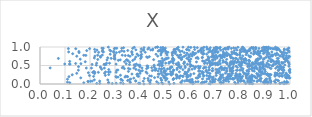
| Category | Series 0 |
|---|---|
| 0.8310107770279482 | 0.358 |
| 0.898913810847134 | 0.953 |
| 0.6540510691226347 | 0.238 |
| 0.3874631804725965 | 0.261 |
| 0.6546207538727327 | 0.905 |
| 0.5547162914851463 | 0.524 |
| 0.7137941692079827 | 0.531 |
| 0.9398200858943669 | 0.945 |
| 0.3341971248897787 | 0.979 |
| 0.849325830463019 | 0.447 |
| 0.9521932139375623 | 0.795 |
| 0.4832545874102593 | 0.983 |
| 0.8845274134972081 | 0.717 |
| 0.9255671018323791 | 0.642 |
| 0.8330063047213393 | 0.155 |
| 0.7443946813726824 | 0.078 |
| 0.580040295929516 | 0.325 |
| 0.4129959694963846 | 0.076 |
| 0.2143592115713148 | 0.206 |
| 0.7431489190879789 | 0.936 |
| 0.27392977666990687 | 0.325 |
| 0.6291189782104226 | 0.981 |
| 0.3923141950374478 | 0.512 |
| 0.5480994509107668 | 0.943 |
| 0.475970111480921 | 0.611 |
| 0.778710897008461 | 0.045 |
| 0.9074800867668688 | 0.068 |
| 0.9037776620426404 | 0.028 |
| 0.7702806819108841 | 0.613 |
| 0.8894891133310451 | 0.544 |
| 0.902071237305825 | 0.97 |
| 0.6762399553611516 | 0.138 |
| 0.7959046290315613 | 0.523 |
| 0.8063001542431134 | 0.597 |
| 0.7995433114804191 | 0.262 |
| 0.5044821907666558 | 0.259 |
| 0.8877825379417206 | 0.901 |
| 0.9592627329327018 | 0.286 |
| 0.9218647605759679 | 0.099 |
| 0.31314582801352503 | 0.639 |
| 0.48806872565542664 | 0.493 |
| 0.5532084250079843 | 0.579 |
| 0.6346657429753184 | 0.426 |
| 0.5873736780547346 | 0.693 |
| 0.6345669806234511 | 0.234 |
| 0.7998804199698862 | 0.195 |
| 0.7414811162366485 | 0.586 |
| 0.6562707594658288 | 0.619 |
| 0.8279009361200589 | 0.838 |
| 0.4900773159576684 | 0.24 |
| 0.49239196022669435 | 0.628 |
| 0.4160103909899449 | 0.983 |
| 0.959775182891374 | 0.015 |
| 0.9649558132031538 | 0.451 |
| 0.45050235401471367 | 0.92 |
| 0.30456789780079735 | 0.317 |
| 0.8415299077367656 | 0.116 |
| 0.8011147144769322 | 0.486 |
| 0.8969722543994947 | 0.019 |
| 0.9728971732582194 | 0.575 |
| 0.7853067797263139 | 0.688 |
| 0.6498396132868661 | 0.722 |
| 0.7602873724734117 | 0.766 |
| 0.8254573203163951 | 0.195 |
| 0.7308539335273225 | 0.789 |
| 0.6920900001822458 | 0.053 |
| 0.46241911056471585 | 0.986 |
| 0.7595983822720573 | 0.562 |
| 0.7672013793731606 | 0.405 |
| 0.8679928045993506 | 0.068 |
| 0.6739168676081639 | 0.68 |
| 0.35333008425872686 | 0.769 |
| 0.4028701660838291 | 0.773 |
| 0.8544608049566019 | 0.805 |
| 0.8316969790569037 | 0.26 |
| 0.8065929921884155 | 0.168 |
| 0.7323330656259425 | 0.634 |
| 0.7089510329999497 | 0.963 |
| 0.525741750297624 | 0.456 |
| 0.8789379566468505 | 0.83 |
| 0.8711829305682173 | 0.235 |
| 0.9464603138654758 | 0.925 |
| 0.8808273798991788 | 0.452 |
| 0.9774131302801313 | 0.063 |
| 0.48878923274467956 | 0.689 |
| 0.7926032203062251 | 0.115 |
| 0.976044360381164 | 0.004 |
| 0.784599218313341 | 0.803 |
| 0.7714492497278236 | 0.435 |
| 0.6716636666285167 | 0.653 |
| 0.6502360847395897 | 0.279 |
| 0.10988232788745472 | 0.13 |
| 0.3770361983834333 | 0.991 |
| 0.42662149881589484 | 0.732 |
| 0.8401600159463561 | 0.728 |
| 0.9835821674586454 | 0.674 |
| 0.818027853412925 | 0.585 |
| 0.6946045362454685 | 0.766 |
| 0.8433917204133137 | 0.162 |
| 0.7103591641817691 | 0.52 |
| 0.7499963302227528 | 0.984 |
| 0.7816802533556325 | 0.167 |
| 0.9473584775730104 | 0.57 |
| 0.6332073159849776 | 0.477 |
| 0.4991087076850885 | 0.362 |
| 0.7414949693387397 | 0.116 |
| 0.8954014955766977 | 0.28 |
| 0.3901637387843155 | 0.213 |
| 0.9901921086657071 | 0.932 |
| 0.4947018814057645 | 0.318 |
| 0.6194026194172059 | 0.451 |
| 0.8623691141625819 | 0.943 |
| 0.5770872422536368 | 0.592 |
| 0.8367386118886505 | 0.903 |
| 0.5085732051234282 | 0.782 |
| 0.8813974761462359 | 0.313 |
| 0.7317172944712216 | 0.586 |
| 0.9995026289255495 | 0.167 |
| 0.7323917930256091 | 0.87 |
| 0.8842106442382358 | 0.242 |
| 0.5490380500892963 | 0.968 |
| 0.14706307284675119 | 0.751 |
| 0.965806114451972 | 0.856 |
| 0.5629650631708083 | 0.045 |
| 0.4840935253730351 | 0.566 |
| 0.8677825730293205 | 0.821 |
| 0.6111828264678153 | 0.859 |
| 0.7560108065812472 | 0.471 |
| 0.6950815745393956 | 0.929 |
| 0.741667561976286 | 0.592 |
| 0.8689529449344396 | 0.815 |
| 0.7105334716028993 | 0.385 |
| 0.9134875279146011 | 0.048 |
| 0.43984963578260705 | 0.049 |
| 0.520646653030767 | 0.445 |
| 0.9084446859639543 | 0.787 |
| 0.5427308140975433 | 0.868 |
| 0.8405144866219514 | 0.064 |
| 0.2778948482536365 | 0.561 |
| 0.7545477409535902 | 0.138 |
| 0.9803553304525544 | 0.605 |
| 0.676051013252801 | 0.45 |
| 0.6247686825269998 | 0.164 |
| 0.8333847532111499 | 0.904 |
| 0.9798389407839876 | 0.846 |
| 0.4725956874228065 | 0.517 |
| 0.35023682881240153 | 0.2 |
| 0.6841654195443744 | 0.19 |
| 0.9606412670425517 | 0.756 |
| 0.8171925395227121 | 0.629 |
| 0.8652312695925554 | 0.66 |
| 0.7477672222256188 | 0.42 |
| 0.9983804236846151 | 0.348 |
| 0.7857297471928586 | 0.37 |
| 0.9272255393161296 | 0.867 |
| 0.879217293120831 | 0.206 |
| 0.9168501956318745 | 0.695 |
| 0.37117588843367755 | 0.637 |
| 0.9362388465612599 | 0.604 |
| 0.9449714545827299 | 0.607 |
| 0.37506067770157875 | 0.158 |
| 0.22062915408735126 | 0.868 |
| 0.2583084597909699 | 0.525 |
| 0.9115873891950943 | 0.956 |
| 0.726774352147922 | 0.384 |
| 0.8817553075434444 | 0.571 |
| 0.4385425575158476 | 0.219 |
| 0.2389344918217612 | 0.015 |
| 0.8039300897386377 | 0.874 |
| 0.9231592055642021 | 0.618 |
| 0.42098778710773344 | 0.859 |
| 0.8997183105528768 | 0.096 |
| 0.9533040395801105 | 0.689 |
| 0.3516914410472728 | 0.631 |
| 0.724952637820579 | 0.044 |
| 0.6258181134650945 | 0.595 |
| 0.8095165996810476 | 0.365 |
| 0.27106096071700114 | 0.11 |
| 0.7158728220097076 | 0.758 |
| 0.789866105139782 | 0.37 |
| 0.3996485300873418 | 0.013 |
| 0.7120369803900983 | 0.299 |
| 0.5533205790661023 | 0.496 |
| 0.9128522499342075 | 0.938 |
| 0.7713443699007935 | 0.15 |
| 0.6845413988958428 | 0.578 |
| 0.2622638686043595 | 0.328 |
| 0.11345961928519897 | 0.957 |
| 0.8528888573004542 | 0.989 |
| 0.48477502539693096 | 0.913 |
| 0.522939904160224 | 0.282 |
| 0.9875496673061606 | 0.832 |
| 0.8206240023487482 | 0.672 |
| 0.7811119521231195 | 0.823 |
| 0.8031293933495766 | 0.381 |
| 0.29994180232330625 | 0.967 |
| 0.5328841448667194 | 0.119 |
| 0.9737978798216494 | 0.443 |
| 0.5309927796124574 | 0.273 |
| 0.6473111218992716 | 0.966 |
| 0.5477458565248681 | 0.196 |
| 0.7315978598934199 | 0.251 |
| 0.7172416947766216 | 0.146 |
| 0.535784255026323 | 0.932 |
| 0.9757967156219038 | 0.685 |
| 0.3807228403256542 | 0.481 |
| 0.6370256151977932 | 0.352 |
| 0.48553321565942525 | 0.293 |
| 0.899670384112283 | 0.079 |
| 0.8952561896358671 | 0.997 |
| 0.8077899506593306 | 0.559 |
| 0.499325156905437 | 0.158 |
| 0.29491346139124913 | 0.853 |
| 0.4310247360817207 | 0.718 |
| 0.985156885218273 | 0.764 |
| 0.5033674877336057 | 0.102 |
| 0.5052461924916255 | 0.247 |
| 0.18524999832942735 | 0.431 |
| 0.8450414376254943 | 0.183 |
| 0.3945082054217518 | 0.208 |
| 0.8439169276649254 | 0.017 |
| 0.7193705397979018 | 0.642 |
| 0.5973887623320678 | 0.746 |
| 0.9239099799512799 | 0.25 |
| 0.5329950253519143 | 0.562 |
| 0.6230409072046375 | 0.83 |
| 0.8069689888433891 | 0.085 |
| 0.5688820297506891 | 0.721 |
| 0.8921633736213997 | 0.911 |
| 0.7827587847772335 | 0.966 |
| 0.6763549033122983 | 0.376 |
| 0.14260642284132147 | 0.554 |
| 0.6086768993685662 | 0.126 |
| 0.8571878037474389 | 0.346 |
| 0.09907804745453262 | 0.54 |
| 0.8407549490183095 | 0.066 |
| 0.950178271335745 | 0.099 |
| 0.7721584476403046 | 0.129 |
| 0.7095821221805166 | 0.572 |
| 0.5651725371380057 | 0.027 |
| 0.4764219467353296 | 0.899 |
| 0.5328176261599242 | 0.684 |
| 0.8882721222144766 | 0.901 |
| 0.724676572609142 | 0.455 |
| 0.30650866921777864 | 0.184 |
| 0.8987105589142876 | 0.85 |
| 0.9097804920680542 | 0.891 |
| 0.2528829802531208 | 0.966 |
| 0.7597314991413845 | 0.785 |
| 0.9886636845234973 | 0.037 |
| 0.873976438663284 | 0.858 |
| 0.11595444398909581 | 0.199 |
| 0.7883020107388226 | 0.251 |
| 0.26602965230152803 | 0.563 |
| 0.8721580116718245 | 0.215 |
| 0.49547877918275396 | 0.424 |
| 0.8361248692064682 | 0.401 |
| 0.5959564175699555 | 0.912 |
| 0.9739760310212294 | 0.388 |
| 0.616940306494386 | 0.797 |
| 0.7469357563131004 | 0.339 |
| 0.2422460849715825 | 0.725 |
| 0.5579404538444357 | 0.772 |
| 0.8390702050578648 | 0.951 |
| 0.6123282612237908 | 0.483 |
| 0.8733390790903882 | 0.796 |
| 0.5066675684986752 | 0.681 |
| 0.8928028797079975 | 0.045 |
| 0.5159165593780775 | 0.558 |
| 0.973412932401149 | 0.453 |
| 0.2962741728043718 | 0.687 |
| 0.5952746428904127 | 0.37 |
| 0.1608799764873733 | 0.671 |
| 0.8168996226560781 | 0.942 |
| 0.29745095348371525 | 0.747 |
| 0.9245184466311898 | 0.603 |
| 0.44572023070721084 | 0.213 |
| 0.48796400169357695 | 0.862 |
| 0.36770618352587797 | 0.269 |
| 0.47273329109977374 | 0.888 |
| 0.9307612166754332 | 0.624 |
| 0.6385553789337394 | 0.264 |
| 0.8361604875694886 | 0.639 |
| 0.5480952965117812 | 0.391 |
| 0.42411137940018234 | 0.325 |
| 0.979353497777742 | 0.668 |
| 0.21901994107908018 | 0.314 |
| 0.990233539932957 | 0.192 |
| 0.5570619922365317 | 0.459 |
| 0.4277107512166789 | 0.487 |
| 0.8559674730150292 | 0.894 |
| 0.9860596251479657 | 0.178 |
| 0.941967630428643 | 0.281 |
| 0.9239644284349605 | 0.417 |
| 0.3598551763916441 | 0.748 |
| 0.8800819617058032 | 0.41 |
| 0.5723234606246189 | 0.212 |
| 0.22686710677309113 | 0.016 |
| 0.6920989914803042 | 0.636 |
| 0.5973925477637794 | 0.073 |
| 0.9647423907510517 | 0.226 |
| 0.8787018227650137 | 0.35 |
| 0.7707294375334107 | 0.152 |
| 0.11875841689782897 | 0.61 |
| 0.7987651789249822 | 0.8 |
| 0.26311228611493914 | 0.524 |
| 0.8357995431627917 | 0.638 |
| 0.9171722605909588 | 0.214 |
| 0.868676827957605 | 0.55 |
| 0.8024046958732404 | 0.138 |
| 0.749937616714364 | 0.19 |
| 0.75861364309273 | 0.504 |
| 0.29946956491571797 | 0.788 |
| 0.6303042974092957 | 0.164 |
| 0.4426821438034973 | 0.1 |
| 0.7820985669663144 | 0.695 |
| 0.7135820946078818 | 0.102 |
| 0.38263105935895414 | 0.085 |
| 0.577666237432893 | 0.589 |
| 0.9928372839313657 | 0.702 |
| 0.6955460769990373 | 0.762 |
| 0.9581088258550733 | 0.405 |
| 0.5183940812617381 | 0.001 |
| 0.6655599960809735 | 0.366 |
| 0.530291145724821 | 0.652 |
| 0.5610258677446649 | 0.702 |
| 0.8505502119942417 | 0.009 |
| 0.3484943293593561 | 0.651 |
| 0.8831921095688857 | 0.538 |
| 0.13063840018600253 | 0.818 |
| 0.8521740466276149 | 0.432 |
| 0.72232360397711 | 0.252 |
| 0.727274911807432 | 0.444 |
| 0.9469645070313905 | 0.558 |
| 0.21825279882837856 | 0.282 |
| 0.859202207237307 | 0.545 |
| 0.9870197331873705 | 0.067 |
| 0.6538518158103037 | 0.819 |
| 0.4337780605240297 | 0.093 |
| 0.6776653697656364 | 0.603 |
| 0.507340403325938 | 0.864 |
| 0.9478457852277057 | 0.974 |
| 0.6091619561932633 | 0.079 |
| 0.3509698254813633 | 0.906 |
| 0.9643359628872321 | 0.414 |
| 0.8478584686017823 | 0.096 |
| 0.33259372507377705 | 0.462 |
| 0.85304804654503 | 0.534 |
| 0.6899711205564897 | 0.118 |
| 0.8443710630418527 | 0.021 |
| 0.43087552476878466 | 0.485 |
| 0.7367890288640014 | 0.382 |
| 0.6460245307777702 | 0.841 |
| 0.9956331902126067 | 0.478 |
| 0.3049819633635724 | 0.018 |
| 0.3706019974507442 | 0.964 |
| 0.6381310569431831 | 0.436 |
| 0.995100712558046 | 0.972 |
| 0.7723665054234549 | 0.359 |
| 0.35871891826285596 | 0.588 |
| 0.6900684817154815 | 0.813 |
| 0.9963353475863782 | 0.868 |
| 0.4561677710182015 | 0.488 |
| 0.9836175759458071 | 0.676 |
| 0.4284427746212669 | 0.291 |
| 0.44689996623253503 | 0.441 |
| 0.23108159156773128 | 0.664 |
| 0.9938478332823799 | 0.579 |
| 0.6099351785126065 | 0.053 |
| 0.8164316022576554 | 0.947 |
| 0.4904965146743663 | 0.945 |
| 0.6410758474255532 | 0.909 |
| 0.8964615308727321 | 0.407 |
| 0.8527648917119955 | 0.953 |
| 0.9900531914794362 | 0.943 |
| 0.7406179762417536 | 0.964 |
| 0.25817852666073116 | 0.291 |
| 0.9494258949175433 | 0.286 |
| 0.9943886227475242 | 0.221 |
| 0.9033939244150223 | 0.907 |
| 0.6547449210043459 | 0.824 |
| 0.9113545963476143 | 0.459 |
| 0.27082496950937235 | 0.709 |
| 0.9490435311890456 | 0.691 |
| 0.7217071986924564 | 0.754 |
| 0.9983016975639671 | 0.742 |
| 0.4266266145861076 | 0.415 |
| 0.5019506027130485 | 0.893 |
| 0.3070021048702466 | 0.966 |
| 0.3447187817375542 | 0.547 |
| 0.7468702455111048 | 0.575 |
| 0.19785572997682532 | 0.228 |
| 0.9693888221752059 | 0.56 |
| 0.9065047094431337 | 0.138 |
| 0.30559778803542215 | 0.847 |
| 0.5873443892619231 | 0.122 |
| 0.9333348442392351 | 0.529 |
| 0.3299746527824436 | 0.095 |
| 0.383387497260428 | 0.924 |
| 0.48492599425427385 | 0.106 |
| 0.8456766905505483 | 0.982 |
| 0.6987181326093905 | 0.065 |
| 0.863544110865237 | 0.977 |
| 0.9770771971878065 | 0.934 |
| 0.7378939025125608 | 0.73 |
| 0.530542159209399 | 0.681 |
| 0.7896782764209068 | 0.79 |
| 0.5551542608140299 | 0.722 |
| 0.9285699495049295 | 0.494 |
| 0.14286855470328114 | 0.953 |
| 0.21945135763071502 | 0.754 |
| 0.5223671747783936 | 0.266 |
| 0.6884787424965289 | 0.354 |
| 0.39078277990317384 | 0.269 |
| 0.6175349040413168 | 0.991 |
| 0.9396977996085155 | 0.811 |
| 0.534623621317967 | 0.861 |
| 0.9241207479653942 | 0.66 |
| 0.7562303848822599 | 0.999 |
| 0.711224023466346 | 0.979 |
| 0.539080291009705 | 0.931 |
| 0.30350240768409364 | 0.199 |
| 0.2993756330037467 | 0.7 |
| 0.929816078206872 | 0.492 |
| 0.32893979727556627 | 0.438 |
| 0.6680046981408732 | 0.315 |
| 0.7226916777363558 | 0.444 |
| 0.5312277922331927 | 0.699 |
| 0.36007160756903805 | 0.057 |
| 0.3697550531453885 | 0.794 |
| 0.7667725908887244 | 0.866 |
| 0.9770708519712423 | 0.918 |
| 0.7748776897212478 | 0.137 |
| 0.2734273601999626 | 0.996 |
| 0.7041614128043884 | 0.393 |
| 0.8560902067362796 | 0.869 |
| 0.6474676827866299 | 0.871 |
| 0.7399050672302835 | 0.439 |
| 0.2790036531104797 | 0.917 |
| 0.9107057009006483 | 0.276 |
| 0.6867776317978763 | 0.869 |
| 0.21072056072947867 | 0.315 |
| 0.8778205691298012 | 0.333 |
| 0.8930344390333194 | 0.902 |
| 0.8348396489269954 | 0.765 |
| 0.5752710972714691 | 0.554 |
| 0.7471417820622401 | 0.183 |
| 0.3269350573609103 | 0.966 |
| 0.9852357943608395 | 0.036 |
| 0.9032441983688767 | 0.975 |
| 0.3228825869000042 | 0.029 |
| 0.3852176013366169 | 0.539 |
| 0.8509596774779628 | 0.577 |
| 0.9574570293711969 | 0.923 |
| 0.27511175463249776 | 0.389 |
| 0.7771158249459279 | 0.901 |
| 0.8623892261526903 | 0.986 |
| 0.7582988836898985 | 0.272 |
| 0.8757577289800369 | 0.961 |
| 0.8107675022804448 | 0.208 |
| 0.6800125170505277 | 0.283 |
| 0.6659383715268737 | 0.647 |
| 0.2086899353400684 | 0.078 |
| 0.9419732951993085 | 0.994 |
| 0.7823165022489852 | 0.013 |
| 0.7052523261326812 | 0.976 |
| 0.8162791977047019 | 0.069 |
| 0.31775897782419177 | 0.864 |
| 0.43124173396204746 | 0.943 |
| 0.9048306018041802 | 0.723 |
| 0.35767431068738775 | 0.116 |
| 0.6787377126766595 | 0.567 |
| 0.7042962507731515 | 0.778 |
| 0.941128506758718 | 0.542 |
| 0.46909230194818624 | 1 |
| 0.7980065261822203 | 0.264 |
| 0.6763749368297192 | 0.007 |
| 0.6686831602402417 | 0.556 |
| 0.14698793081644626 | 0.289 |
| 0.6515169434255599 | 0.969 |
| 0.9373666474346936 | 0.071 |
| 0.8815689311899267 | 0.141 |
| 0.6143169501297642 | 0.841 |
| 0.48716873863296123 | 0.034 |
| 0.8771363332615271 | 0.368 |
| 0.21549198932283975 | 0.336 |
| 0.3265002368660328 | 0.897 |
| 0.6902337534538202 | 0.528 |
| 0.7870262011079618 | 0.58 |
| 0.4401791525064672 | 0.011 |
| 0.8063016562961234 | 0.947 |
| 0.9781342185178028 | 0.237 |
| 0.8330593898638333 | 0.497 |
| 0.5773801760720908 | 0.847 |
| 0.9040595567846385 | 0.477 |
| 0.7046925669230771 | 0.942 |
| 0.485275688706641 | 0.88 |
| 0.7337209351918195 | 0.17 |
| 0.4142441855819173 | 0.92 |
| 0.24771540088240568 | 0.969 |
| 0.2413211287215189 | 0.747 |
| 0.5879117873662637 | 0.836 |
| 0.3613488955932378 | 0.04 |
| 0.8822112161977141 | 0.395 |
| 0.6083130498120184 | 0.399 |
| 0.2537338748649556 | 0.866 |
| 0.9756404184653826 | 0.789 |
| 0.9418440686800704 | 0.036 |
| 0.9077681946379917 | 0.564 |
| 0.8444328271016089 | 0.838 |
| 0.23448636372351986 | 0.856 |
| 0.7447025371878735 | 0.149 |
| 0.5490897532113325 | 0.778 |
| 0.5030736731985336 | 0.563 |
| 0.7354307681895061 | 0.834 |
| 0.9494237680468101 | 0.926 |
| 0.6816923688691929 | 0.074 |
| 0.31152157544843145 | 0.379 |
| 0.48327742066303675 | 0.614 |
| 0.6901457502901144 | 0.418 |
| 0.5687279524769671 | 0.887 |
| 0.8728614677493151 | 0.097 |
| 0.5299045808732 | 0.77 |
| 0.9492616917151503 | 0.466 |
| 0.5665794223697009 | 0.668 |
| 0.19314573584039174 | 0.063 |
| 0.9792224311163397 | 0.516 |
| 0.9223412061521098 | 0.741 |
| 0.6928676745541781 | 0.098 |
| 0.216396505196752 | 0.324 |
| 0.274939378051738 | 0.255 |
| 0.7330144530703269 | 0.934 |
| 0.6962598827652228 | 0.552 |
| 0.8970338502412343 | 0.69 |
| 0.48368850631950255 | 0.783 |
| 0.5653274743367244 | 0.659 |
| 0.762285400756871 | 0.213 |
| 0.2998189101459444 | 0.672 |
| 0.822341685012405 | 0.012 |
| 0.5457566926265096 | 0.155 |
| 0.67749820872649 | 0.623 |
| 0.8557711669066689 | 0.084 |
| 0.7587317895312122 | 0.192 |
| 0.6635625109997457 | 0.447 |
| 0.4667274369172452 | 0.061 |
| 0.9669079653194811 | 0.583 |
| 0.8879336431853783 | 0.28 |
| 0.9895678739255278 | 0.242 |
| 0.48736285701292037 | 0.412 |
| 0.5008748429295719 | 0.291 |
| 0.4723603423984109 | 0.352 |
| 0.8940550855709386 | 0.534 |
| 0.7930970444093849 | 0.087 |
| 0.19839016149536842 | 0.956 |
| 0.9299242261052334 | 0.641 |
| 0.8207368711729668 | 0.684 |
| 0.7734820705292009 | 0.529 |
| 0.7838665885742402 | 0.285 |
| 0.6781393931593421 | 0.925 |
| 0.6155961942403071 | 0.281 |
| 0.522283822823269 | 0.6 |
| 0.9001778856795233 | 0.919 |
| 0.8662639902877934 | 0.429 |
| 0.4026216218493479 | 0.342 |
| 0.5052428794360551 | 0.826 |
| 0.7653745288498834 | 0.96 |
| 0.9244109395940754 | 0.066 |
| 0.8788037618994221 | 0.106 |
| 0.9319397191967519 | 0.958 |
| 0.8302994740464755 | 0.882 |
| 0.8003838530798374 | 0.085 |
| 0.8237642289009974 | 0.274 |
| 0.7897271490719112 | 0.449 |
| 0.9224668809150526 | 0.959 |
| 0.9722528605094733 | 0.742 |
| 0.800508986087937 | 0.202 |
| 0.23857790237229817 | 0.079 |
| 0.5841877517582155 | 0.261 |
| 0.19161789634616588 | 0.071 |
| 0.7233020370011051 | 0.758 |
| 0.16305017412896436 | 0.166 |
| 0.5346231953289027 | 0.144 |
| 0.5324592170812688 | 0.872 |
| 0.7024664280460807 | 0.861 |
| 0.7419926221279237 | 0.294 |
| 0.7485385837241315 | 0.766 |
| 0.41722618347934065 | 0.151 |
| 0.378668628567752 | 0.673 |
| 0.5710264181577273 | 0.203 |
| 0.7371509277680693 | 0.101 |
| 0.858051596478115 | 0.411 |
| 0.9129585531591582 | 0.224 |
| 0.879051530604114 | 0.46 |
| 0.7179863585434241 | 0.321 |
| 0.7637545341106964 | 0.703 |
| 0.7478773598622027 | 0.775 |
| 0.6034088463593736 | 0.988 |
| 0.8593416241151269 | 0.87 |
| 0.7331013892329434 | 0.747 |
| 0.8954136788222952 | 0.401 |
| 0.6927038512649093 | 0.127 |
| 0.6573185565074774 | 0.451 |
| 0.9682425550416196 | 0.802 |
| 0.6784758747581704 | 0.606 |
| 0.7014891916638493 | 0.893 |
| 0.328971949197199 | 0.778 |
| 0.8282525818553645 | 0.547 |
| 0.955486856208673 | 0.61 |
| 0.7839528918927696 | 0.828 |
| 0.9258860055956202 | 0.616 |
| 0.6488171552405242 | 0.71 |
| 0.24675161284589595 | 0.399 |
| 0.18086311998403706 | 0.601 |
| 0.32099876357182927 | 0.652 |
| 0.9224318949337166 | 0.023 |
| 0.7931159071042841 | 0.199 |
| 0.6674631371435487 | 0.944 |
| 0.7384466544204774 | 0.955 |
| 0.8816296499369929 | 0.752 |
| 0.5081010259412233 | 0.144 |
| 0.24118804679117298 | 0.459 |
| 0.4063593861383939 | 0.801 |
| 0.7242333844621904 | 0.017 |
| 0.949382888427395 | 0.254 |
| 0.6371623707894964 | 0.436 |
| 0.5576699753262157 | 0.329 |
| 0.7710795306818927 | 0.7 |
| 0.5344899512060252 | 0.372 |
| 0.5288655780720963 | 0.845 |
| 0.22647649152468632 | 0.563 |
| 0.7282057001911577 | 0.708 |
| 0.721829003158259 | 0.19 |
| 0.4564453358473463 | 0.51 |
| 0.8302491935366648 | 0.058 |
| 0.8891968219058203 | 0.892 |
| 0.6815681438791729 | 0.883 |
| 0.8743502698854375 | 0.53 |
| 0.8500167287355727 | 0.36 |
| 0.33734435041015254 | 0.415 |
| 0.7520038514655498 | 0.259 |
| 0.3536481894787684 | 0.339 |
| 0.6106588218363763 | 0.009 |
| 0.6809181485521204 | 0.515 |
| 0.7048458977747857 | 0.232 |
| 0.4491037146113627 | 0.363 |
| 0.49529928380518756 | 0.182 |
| 0.7629240656444726 | 0.376 |
| 0.7169529977538894 | 0.964 |
| 0.8750281141554895 | 0.678 |
| 0.5562726990579163 | 0.529 |
| 0.5789940628918003 | 0.078 |
| 0.800344183935476 | 0.913 |
| 0.6099030763478587 | 0.798 |
| 0.9570604877019534 | 0.21 |
| 0.46407799032516595 | 0.804 |
| 0.8936617729251873 | 0.823 |
| 0.6408205336475691 | 0.468 |
| 0.7340638432804777 | 0.407 |
| 0.5628510898319151 | 0.789 |
| 0.5472470610929672 | 0.244 |
| 0.9034061234913908 | 0.098 |
| 0.7606475886441987 | 0.431 |
| 0.6723072360792366 | 0.737 |
| 0.9847011815270134 | 0.019 |
| 0.7773125583327491 | 0.834 |
| 0.7295999641542742 | 0.752 |
| 0.951257286656822 | 0.593 |
| 0.5904192444016824 | 0.207 |
| 0.8368219212199276 | 0.014 |
| 0.5783673214490304 | 0.273 |
| 0.511650555507889 | 0.856 |
| 0.8620745279401377 | 0.841 |
| 0.4769495412205024 | 0.414 |
| 0.6085472074896513 | 0.755 |
| 0.5026610161771184 | 0.17 |
| 0.6570584597606629 | 0.047 |
| 0.6597934452105123 | 0.587 |
| 0.6091134297616964 | 0.79 |
| 0.733224934502126 | 0.033 |
| 0.9325774100631936 | 0.505 |
| 0.5252503441961565 | 0.24 |
| 0.2575239356959542 | 0.431 |
| 0.7862957671854988 | 0.214 |
| 0.8189359230595022 | 0.917 |
| 0.4782438441090467 | 0.914 |
| 0.7739579783200724 | 0.573 |
| 0.6961656041013105 | 0.972 |
| 0.5942626822338157 | 0.09 |
| 0.35366321273031837 | 0.422 |
| 0.6346939727518032 | 0.349 |
| 0.3599193927237274 | 0.404 |
| 0.9857563063004197 | 0.707 |
| 0.49542835130233576 | 0.922 |
| 0.8393380414658137 | 0.907 |
| 0.7236535489208561 | 0.155 |
| 0.6403096931567116 | 0.347 |
| 0.8641351860251106 | 0.575 |
| 0.8213988163714318 | 0.566 |
| 0.7810806017418098 | 0.228 |
| 0.8146587196796111 | 0.961 |
| 0.7753024861692873 | 0.592 |
| 0.24933979845055365 | 0.782 |
| 0.4848256467902829 | 0.408 |
| 0.950935116806817 | 0.463 |
| 0.7632349125515868 | 0.14 |
| 0.7875531819855582 | 0.917 |
| 0.49638016004392355 | 0.208 |
| 0.4980438288515944 | 0.936 |
| 0.7167589581636458 | 0.349 |
| 0.2943303364709005 | 0.884 |
| 0.6810625426295852 | 0.978 |
| 0.6010287060553567 | 0.533 |
| 0.9202952063626678 | 0.252 |
| 0.7909970384322296 | 0.605 |
| 0.9967758449417506 | 0.369 |
| 0.8904344526150773 | 0.571 |
| 0.5716487950670943 | 0.389 |
| 0.8151735527920264 | 0.088 |
| 0.8693063201502446 | 0.407 |
| 0.7963210208021991 | 0.59 |
| 0.399170894087304 | 0.509 |
| 0.8620156007760276 | 0.612 |
| 0.1146275089799524 | 0.866 |
| 0.8050760659259099 | 0.134 |
| 0.8668762197523987 | 0.284 |
| 0.4545425820828335 | 0.658 |
| 0.7916718872350677 | 0.993 |
| 0.24298392754891146 | 0.44 |
| 0.6651672458259194 | 0.066 |
| 0.8655090264332732 | 0.625 |
| 0.7576118965497449 | 0.227 |
| 0.8773325578797859 | 0.768 |
| 0.2749026217563492 | 0.038 |
| 0.9944738481575238 | 0.215 |
| 0.11913685893264614 | 0.033 |
| 0.8192565331529212 | 0.877 |
| 0.9680646054293314 | 0.032 |
| 0.9906542597435224 | 0.045 |
| 0.6484006870205676 | 0.335 |
| 0.47360433451734646 | 0.018 |
| 0.7364598474839493 | 0.81 |
| 0.9730696432040266 | 0.855 |
| 0.595156832795216 | 0.403 |
| 0.8720121030990552 | 0.878 |
| 0.30426905009879496 | 0.537 |
| 0.7997626357508593 | 0.226 |
| 0.17511852568333347 | 0.777 |
| 0.5808249364203024 | 0.443 |
| 0.7102952144040914 | 0.853 |
| 0.5163704436691184 | 0.587 |
| 0.7679582678257174 | 0.808 |
| 0.6909677614120155 | 0.363 |
| 0.2305816976898456 | 0.779 |
| 0.6187329710655042 | 0.932 |
| 0.48305950123552993 | 0.154 |
| 0.9100229351264332 | 0.27 |
| 0.20583228946728865 | 0.43 |
| 0.9424177142007819 | 0.248 |
| 0.3671534353589231 | 0.876 |
| 0.19333315050137298 | 0.304 |
| 0.9636961312440334 | 0.411 |
| 0.7204913174097556 | 0.042 |
| 0.249295449210858 | 0.883 |
| 0.9473000611265406 | 0.284 |
| 0.8709404602227948 | 0.633 |
| 0.8247512271697007 | 0.896 |
| 0.8065540074831514 | 0.706 |
| 0.7461741728433685 | 0.853 |
| 0.4811750855510915 | 0.909 |
| 0.5603617070451238 | 0.876 |
| 0.5048107773004187 | 0.693 |
| 0.7779111396806101 | 0.571 |
| 0.393102343779676 | 0.77 |
| 0.3837891434809383 | 0.395 |
| 0.8797102109628325 | 0.687 |
| 0.6897531363084889 | 0.655 |
| 0.46418223116449436 | 0.409 |
| 0.9435038748715396 | 0.115 |
| 0.32183556085752 | 0.237 |
| 0.7920025043576326 | 0.025 |
| 0.8238673037604983 | 0.279 |
| 0.20841497712628299 | 0.53 |
| 0.59143135680277 | 0.189 |
| 0.4321595363341501 | 0.148 |
| 0.833010113805631 | 0.285 |
| 0.69030842890841 | 0.755 |
| 0.8563895578334493 | 0.827 |
| 0.5806455233373358 | 0.48 |
| 0.8116316691239254 | 0.596 |
| 0.5617525132481773 | 0.433 |
| 0.5187216546808582 | 0.404 |
| 0.7663319894068873 | 0.344 |
| 0.6818457565104995 | 0.502 |
| 0.4158085413974266 | 0.001 |
| 0.6503675381247833 | 0.623 |
| 0.22782084833173133 | 0.918 |
| 0.826200696698796 | 0.844 |
| 0.6758595185424439 | 0.705 |
| 0.8139131533990533 | 0.311 |
| 0.575999178962032 | 0.56 |
| 0.5719063786544288 | 0.996 |
| 0.7070611374832858 | 0.323 |
| 0.2807203752867712 | 0.805 |
| 0.40266765879695376 | 0.691 |
| 0.34105912553471696 | 0.769 |
| 0.7026879218386318 | 0.523 |
| 0.48418588358873116 | 0.821 |
| 0.25638409192487654 | 0.533 |
| 0.6577891287005475 | 0.552 |
| 0.9868097362227318 | 0.648 |
| 0.47198391978177967 | 0.192 |
| 0.6964099051742609 | 0.85 |
| 0.6483627857352425 | 0.042 |
| 0.7915376763963347 | 0.104 |
| 0.435356915579327 | 0.977 |
| 0.48809849109265896 | 0.533 |
| 0.5971109003645594 | 0.618 |
| 0.9963198485067687 | 0.159 |
| 0.7188425721191647 | 0.138 |
| 0.8110888155135436 | 0.992 |
| 0.7602696552099163 | 0.351 |
| 0.9872160349241456 | 0.186 |
| 0.8455412921706652 | 0.498 |
| 0.3120859804385088 | 0.187 |
| 0.5840605030525805 | 0.774 |
| 0.38324051098456857 | 0.08 |
| 0.9773616682166977 | 0.942 |
| 0.9526954431358801 | 0.369 |
| 0.5589211014054778 | 0.208 |
| 0.8384133005027437 | 0.203 |
| 0.912350696116193 | 0.623 |
| 0.8948970699921651 | 0.479 |
| 0.8710474398186325 | 0.889 |
| 0.10995014560454254 | 0.051 |
| 0.8002414837523851 | 0.712 |
| 0.9022639754244896 | 0.98 |
| 0.6326235193998899 | 0.69 |
| 0.531530660409236 | 0.339 |
| 0.6506642221209796 | 0.033 |
| 0.7016745573112483 | 0.127 |
| 0.6760611194046658 | 0.155 |
| 0.20213290063564326 | 0.074 |
| 0.48224512335006225 | 0.903 |
| 0.5292153206895478 | 0.606 |
| 0.8770638879182749 | 0.233 |
| 0.9470421615738975 | 0.832 |
| 0.9967801594474659 | 0.536 |
| 0.5628972454880211 | 0.222 |
| 0.7469210554110123 | 0.362 |
| 0.8000630120705293 | 0.777 |
| 0.7421445098786272 | 0.787 |
| 0.5113279764089231 | 0.267 |
| 0.5939773439039668 | 0.663 |
| 0.47898700150702145 | 0.498 |
| 0.6452603744649497 | 0.931 |
| 0.7052343214774639 | 0.299 |
| 0.7067356884185207 | 0.976 |
| 0.38290324130984243 | 0.727 |
| 0.720606515493309 | 0.781 |
| 0.3243356345791632 | 0.129 |
| 0.8461225398212632 | 0.216 |
| 0.8746631916689146 | 0.219 |
| 0.6669708752543292 | 0.23 |
| 0.8147441429563985 | 0.667 |
| 0.666539597880723 | 0.807 |
| 0.9139806934845582 | 0.843 |
| 0.6316208495618642 | 0.166 |
| 0.4045883904790593 | 0.873 |
| 0.26801374398210553 | 0.651 |
| 0.6779804056605166 | 0.222 |
| 0.7410192055276464 | 0.797 |
| 0.7518245829599963 | 0.946 |
| 0.8095817010161919 | 0.99 |
| 0.32414479311600336 | 0.124 |
| 0.7606870806341803 | 0.394 |
| 0.7798591574162029 | 0.622 |
| 0.2739298216795751 | 0.03 |
| 0.49581124935183396 | 0.351 |
| 0.4917229536687666 | 0.988 |
| 0.7921211533650886 | 0.658 |
| 0.3751891714470741 | 0.431 |
| 0.717672981322414 | 0.42 |
| 0.23345688617129323 | 0.315 |
| 0.5691297657478264 | 0.089 |
| 0.8452030432576629 | 0.402 |
| 0.8387372394528875 | 0.612 |
| 0.8358618261443497 | 0.556 |
| 0.8984709820596029 | 0.981 |
| 0.33321076226574786 | 0.011 |
| 0.4624384910511621 | 0.37 |
| 0.34564926093192605 | 0.651 |
| 0.9824152577484341 | 0.176 |
| 0.8911977127490565 | 0.603 |
| 0.7997312667810491 | 0.208 |
| 0.8480836282417292 | 0.557 |
| 0.8309881311933791 | 0.469 |
| 0.7902897951381489 | 0.142 |
| 0.858386816685108 | 0.208 |
| 0.7371230313332393 | 0.41 |
| 0.2174032032300324 | 0.703 |
| 0.6188515943490335 | 0.415 |
| 0.9679418684545039 | 0.281 |
| 0.7698293322802792 | 0.285 |
| 0.6338212100547546 | 0.875 |
| 0.8880066332206504 | 0.317 |
| 0.6930244470950961 | 0.188 |
| 0.7253734020856581 | 0.442 |
| 0.7753686685693959 | 0.841 |
| 0.6060387205587634 | 0.499 |
| 0.5279824884950491 | 0.457 |
| 0.2972790309167071 | 0.956 |
| 0.6752440788675181 | 0.205 |
| 0.8245358584842423 | 0.793 |
| 0.4899160417770541 | 0.571 |
| 0.3398546667868843 | 0.188 |
| 0.5289906871247779 | 0.815 |
| 0.603795657762653 | 0.038 |
| 0.8718256291677869 | 0.266 |
| 0.994309282024441 | 0.905 |
| 0.6727267051098951 | 0.303 |
| 0.45758894058333 | 0.377 |
| 0.5898326923602452 | 0.535 |
| 0.7336211023708996 | 0.092 |
| 0.9884097179676549 | 0.195 |
| 0.8079140999761636 | 0.941 |
| 0.35789582296128725 | 0.526 |
| 0.5341866117731168 | 0.379 |
| 0.8829220795209837 | 0.075 |
| 0.22522381376450787 | 0.509 |
| 0.8421481004075693 | 0.746 |
| 0.9179747065944299 | 0.804 |
| 0.5558476354250191 | 0.915 |
| 0.5768072012109967 | 0.748 |
| 0.6538164080793809 | 0.315 |
| 0.4374360880156515 | 0.74 |
| 0.5013606653967825 | 0.969 |
| 0.7678865601240836 | 0.307 |
| 0.9595093862740488 | 0.755 |
| 0.9541266397458686 | 0.087 |
| 0.8997399275779215 | 0.383 |
| 0.8411555549296996 | 0.16 |
| 0.48873898035768776 | 0.497 |
| 0.484295741063415 | 0.348 |
| 0.8035802280480985 | 0.154 |
| 0.7649500396354179 | 0.232 |
| 0.8120097474981343 | 0.411 |
| 0.4707466299455182 | 0.994 |
| 0.6500657573497444 | 0.137 |
| 0.5025552367519754 | 0.352 |
| 0.9009456238253335 | 0.288 |
| 0.1534595446596966 | 0.373 |
| 0.5478534544969538 | 0.529 |
| 0.2184161043851983 | 0.935 |
| 0.7653983849819755 | 0.727 |
| 0.9270543138031833 | 0.779 |
| 0.9634801990462528 | 0.471 |
| 0.7227572087059807 | 0.917 |
| 0.9690603454322674 | 0.206 |
| 0.3361729959081416 | 0.881 |
| 0.7745106880414278 | 0.975 |
| 0.8622624570654568 | 0.173 |
| 0.9617975206144943 | 0.881 |
| 0.5947927846748634 | 0.729 |
| 0.289211885024772 | 0.012 |
| 0.9754234869739675 | 0.367 |
| 0.594325422161787 | 0.789 |
| 0.9189331420195876 | 0.109 |
| 0.7527187740119904 | 0.948 |
| 0.827595746895046 | 0.36 |
| 0.8669043835640576 | 0.161 |
| 0.8020529065302896 | 0.077 |
| 0.44271243018463924 | 0.92 |
| 0.720995140486219 | 0.546 |
| 0.9405154579464403 | 0.301 |
| 0.040599655982496895 | 0.435 |
| 0.9062313636521603 | 0.981 |
| 0.6809854850081876 | 0.006 |
| 0.9844446884681956 | 0.295 |
| 0.7529348398233375 | 0.81 |
| 0.6538685456846468 | 0.423 |
| 0.893556838827981 | 0.668 |
| 0.9601889751495398 | 0.014 |
| 0.8422080176148001 | 0.097 |
| 0.9088220632381822 | 0.844 |
| 0.9067616153579242 | 0.255 |
| 0.3769037786762437 | 0.521 |
| 0.5037988060743898 | 0.859 |
| 0.8894090845049613 | 0.976 |
| 0.8379255259458004 | 0.474 |
| 0.533140258547826 | 0.624 |
| 0.846149632420773 | 0.98 |
| 0.9611495754354991 | 0.512 |
| 0.705619530105065 | 0.918 |
| 0.676748146630393 | 0.389 |
| 0.3492170855385087 | 0.198 |
| 0.18340139538319594 | 0.773 |
| 0.8251162210872872 | 0.23 |
| 0.9201490157329211 | 0.257 |
| 0.7235837452120679 | 0.702 |
| 0.8745592352694769 | 0.552 |
| 0.39506014650294335 | 0.371 |
| 0.6523051917395014 | 0.804 |
| 0.805738587670833 | 0.662 |
| 0.5879886851422436 | 0.929 |
| 0.7022238762211135 | 0.562 |
| 0.9486255907969307 | 0.61 |
| 0.90694749672057 | 0.993 |
| 0.9187310701196926 | 0.144 |
| 0.8311994827524144 | 0.104 |
| 0.721055977335487 | 0.99 |
| 0.5865137712336244 | 0.197 |
| 0.8586252836130629 | 0.456 |
| 0.41386320550027617 | 0.917 |
| 0.8122824966527402 | 0.883 |
| 0.7466764362609877 | 0.667 |
| 0.8898135691264557 | 0.556 |
| 0.9993483626706856 | 0.397 |
| 0.36757950557498986 | 0.845 |
| 0.7209953532817781 | 0.115 |
| 0.5858468001490945 | 0.288 |
| 0.708540022394431 | 0.704 |
| 0.8059011641812233 | 0.514 |
| 0.39442204731152747 | 0.019 |
| 0.7272253662272294 | 0.724 |
| 0.904565376646871 | 0.127 |
| 0.5236721462005055 | 0.453 |
| 0.15553552611029983 | 0.879 |
| 0.7635973035003466 | 0.604 |
| 0.9435136106880776 | 0.775 |
| 0.4317398255775534 | 0.443 |
| 0.825338044673381 | 0.159 |
| 0.847005699958952 | 0.141 |
| 0.07355209021966318 | 0.69 |
| 0.7529912466612444 | 0.219 |
| 0.6330447262156359 | 0.879 |
| 0.5642271385379939 | 0.464 |
| 0.9132684755855888 | 0.531 |
| 0.69088276861301 | 0.141 |
| 0.6001205623576931 | 0.605 |
| 0.1540795796519386 | 0.468 |
| 0.9908153330374015 | 0.913 |
| 0.7727231567103581 | 0.461 |
| 0.3382934369051657 | 0.603 |
| 0.29846778997493556 | 0.78 |
| 0.18690419976514322 | 0.902 |
| 0.9138309004642478 | 0.737 |
| 0.4058026726860286 | 0.73 |
| 0.6903732700183882 | 0.903 |
| 0.3432626158654761 | 0.212 |
| 0.6948750196209901 | 0.717 |
| 0.8710567577334711 | 0.682 |
| 0.7040625661773301 | 0.994 |
| 0.9536167037317844 | 0.572 |
| 0.7999007181768143 | 0.841 |
| 0.47294015639980175 | 0.266 |
| 0.8482644008387595 | 0.181 |
| 0.6298308861381409 | 0.719 |
| 0.8025827964659284 | 0.556 |
| 0.700697001305992 | 0.668 |
| 0.7883428829655744 | 0.798 |
| 0.4772143034961403 | 0.268 |
| 0.9863457149173361 | 0.263 |
| 0.9553925470637208 | 0.543 |
| 0.6357737954073978 | 0.891 |
| 0.799366030823947 | 0.374 |
| 0.6034358597035109 | 0.675 |
| 0.601023898494137 | 0.474 |
| 0.9695738609480349 | 0.372 |
| 0.7697174058382715 | 0.576 |
| 0.45822099402902294 | 0.172 |
| 0.9179019172643785 | 0.513 |
| 0.5511285691832971 | 0.204 |
| 0.39996930816153764 | 0.288 |
| 0.8797307768095916 | 0.531 |
| 0.8051177763397409 | 0.168 |
| 0.8884723322321875 | 0.338 |
| 0.5338305107361411 | 0.141 |
| 0.9867340847175516 | 0.159 |
| 0.9484014522174167 | 0.244 |
| 0.6009642651301527 | 0.112 |
| 0.2831818705456605 | 0.891 |
| 0.7378998327271562 | 0.805 |
| 0.35056246323613055 | 0.094 |
| 0.16367814131898145 | 0.549 |
| 0.6576143254352442 | 0.054 |
| 0.49119507550171015 | 0.008 |
| 0.5132957047307111 | 0.701 |
| 0.8520310387333575 | 0.216 |
| 0.596853521244159 | 0.621 |
| 0.7126118110340016 | 0.87 |
| 0.9993774947254163 | 0.311 |
| 0.6892334680468754 | 0.044 |
| 0.7618400220290107 | 0.735 |
| 0.6447484886022156 | 0.957 |
| 0.9194353545619915 | 0.439 |
| 0.9562316171277647 | 0.462 |
| 0.9394270912262865 | 0.239 |
| 0.7686694563794241 | 0.433 |
| 0.12029519771288615 | 0.537 |
| 0.9600822297052409 | 0.415 |
| 0.6322359983720167 | 0.063 |
| 0.7845944889912666 | 0.2 |
| 0.8166973187165705 | 0.278 |
| 0.7488350878327625 | 0.536 |
| 0.4909312583843877 | 0.885 |
| 0.7842081514865211 | 0.481 |
| 0.45797394897206545 | 0.449 |
| 0.8894732598218513 | 0.441 |
| 0.5484651357326357 | 0.429 |
| 0.5864385360443594 | 0.933 |
| 0.4709045314723142 | 0.753 |
| 0.5295839461708411 | 0.322 |
| 0.6640182229373117 | 0.355 |
| 0.88483942300226 | 0.151 |
| 0.6025583940142459 | 0.805 |
| 0.8268688594298478 | 0.239 |
| 0.8474303985801575 | 0.245 |
| 0.7644099444357813 | 0.541 |
| 0.6666415898212854 | 0.997 |
| 0.5904420729087407 | 0.243 |
| 0.6855271679886835 | 0.736 |
| 0.8053385604939031 | 0.448 |
| 0.9300932767002984 | 0.757 |
| 0.5883574090415327 | 0.086 |
| 0.5445266750135344 | 0.544 |
| 0.4094189452514596 | 0.36 |
| 0.5097800992215372 | 0.407 |
| 0.6137297115057331 | 0.017 |
| 0.5410408419006426 | 0.824 |
| 0.9497504262978572 | 0.962 |
| 0.7639151077145139 | 0.592 |
| 0.5903214475213513 | 0.328 |
| 0.1289666744133175 | 0.249 |
| 0.9426674517651213 | 0.425 |
| 0.952816083398501 | 0.955 |
| 0.9828209932171568 | 0.696 |
| 0.26134942250848986 | 0.233 |
| 0.5530371711766099 | 0.992 |
| 0.6895548299295592 | 0.564 |
| 0.6684833783654021 | 0.137 |
| 0.477275937826166 | 0.536 |
| 0.6029628744371544 | 0.261 |
| 0.6386806364906834 | 0.258 |
| 0.6547627064340265 | 0.209 |
| 0.5358135524914676 | 0.018 |
| 0.9942477587910061 | 0.753 |
| 0.5442805347637649 | 0.249 |
| 0.6243472305421374 | 0.702 |
| 0.8907977671189766 | 0.486 |
| 0.990136178357534 | 0.623 |
| 0.8349770478349112 | 0.339 |
| 0.9322102725183218 | 0.948 |
| 0.9228217506388761 | 0.966 |
| 0.9727757073747945 | 0.312 |
| 0.910555840369746 | 0.016 |
| 0.6449679806972713 | 0.021 |
| 0.9141482342442874 | 0.996 |
| 0.9696663709602434 | 0.741 |
| 0.5225738721938308 | 0.332 |
| 0.6229089028401835 | 0.058 |
| 0.38811278741812283 | 0.811 |
| 0.7270804057731207 | 0.216 |
| 0.7545467533418867 | 0.065 |
| 0.800537911814556 | 0.262 |
| 0.6235423680415132 | 0.466 |
| 0.3069019772195409 | 0.371 |
| 0.7738830870980163 | 0.686 |
| 0.8263077191290661 | 0.636 |
| 0.9400729085411009 | 0.209 |
| 0.5938346833671289 | 0.994 |
| 0.6742804959810799 | 0.859 |
| 0.7175595997009101 | 0.606 |
| 0.9947990609276577 | 0.58 |
| 0.9542716655446517 | 0.365 |
| 0.2174053654031505 | 0.112 |
| 0.9195036540455958 | 0.172 |
| 0.36325757787241225 | 0.135 |
| 0.6988830399829027 | 0.726 |
| 0.9045089204641817 | 0.508 |
| 0.6559208550991978 | 0.995 |
| 0.6494997242202474 | 0.316 |
| 0.40537965626117484 | 0.951 |
| 0.8378372263781239 | 0.521 |
| 0.5355919749214845 | 0.656 |
| 0.8985521329942121 | 0.072 |
| 0.15627710418345314 | 0.848 |
| 0.2505922977988381 | 0.912 |
| 0.541484604497322 | 0.933 |
| 0.972846392265948 | 0.732 |
| 0.40786092199120605 | 0.435 |
| 0.4865984446289796 | 0.102 |
| 0.9307067393290145 | 0.787 |
| 0.11794036468624944 | 0.538 |
| 0.638983491318396 | 0.201 |
| 0.9014618965714998 | 0.336 |
| 0.2806790749013796 | 0.324 |
| 0.8206567657401493 | 0.682 |
| 0.5576698501438467 | 0.16 |
| 0.8639496011437294 | 0.481 |
| 0.17518360245616554 | 0.032 |
| 0.45128124665687974 | 0.947 |
| 0.811449672042299 | 0.76 |
| 0.5563592732341299 | 0.728 |
| 0.515144864907019 | 0.054 |
| 0.3989510947039056 | 0.467 |
| 0.6010827423204387 | 0.221 |
| 0.8813434360628092 | 0.881 |
| 0.7078551812617698 | 0.734 |
| 0.6718990310022136 | 0.943 |
| 0.7505910671686873 | 0.124 |
| 0.49859181908765365 | 0.661 |
| 0.8919019521578438 | 0.429 |
| 0.28462383608254543 | 0.693 |